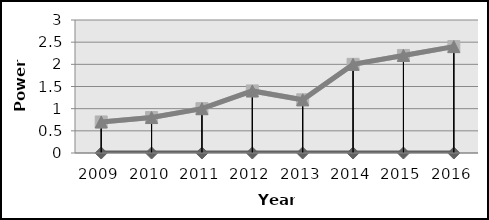
| Category | Series 0 | Series 1 | Series 2 |
|---|---|---|---|
| 2009.0 |  | 0.7 |  |
| 2010.0 |  | 0.8 |  |
| 2011.0 |  | 1 |  |
| 2012.0 |  | 1.4 |  |
| 2013.0 |  | 1.2 |  |
| 2014.0 |  | 2 |  |
| 2015.0 |  | 2.2 |  |
| 2016.0 |  | 2.4 |  |